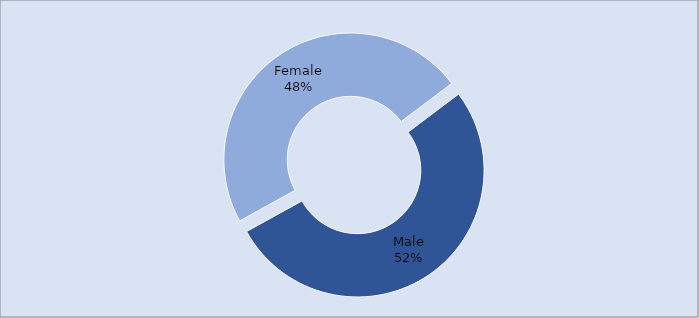
| Category | Series 0 |
|---|---|
| Male | 952 |
| Female | 870 |